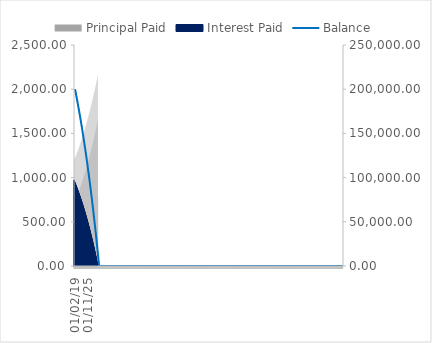
| Category | Principal Paid | Interest Paid |
|---|---|---|
| 01-02-19 | 1197.078 | 973.51 |
| 01-03-19 | 702.905 | 967.683 |
| 01-04-19 | 1206.326 | 964.262 |
| 01-05-19 | 712.198 | 958.39 |
| 01-06-19 | 1215.665 | 954.923 |
| 01-07-19 | 721.582 | 949.006 |
| 01-08-19 | 1225.095 | 945.494 |
| 01-09-19 | 731.058 | 939.53 |
| 01-10-19 | 1234.616 | 935.972 |
| 01-11-19 | 740.626 | 929.962 |
| 01-12-19 | 1244.231 | 926.357 |
| 01-01-20 | 750.287 | 920.301 |
| 01-02-20 | 1253.939 | 916.649 |
| 01-03-20 | 760.043 | 910.545 |
| 01-04-20 | 1263.742 | 906.846 |
| 01-05-20 | 769.894 | 900.695 |
| 01-06-20 | 1273.641 | 896.947 |
| 01-07-20 | 779.841 | 890.748 |
| 01-08-20 | 1283.637 | 886.952 |
| 01-09-20 | 789.885 | 880.703 |
| 01-10-20 | 1293.73 | 876.859 |
| 01-11-20 | 800.027 | 870.561 |
| 01-12-20 | 1303.921 | 866.667 |
| 01-01-21 | 810.268 | 860.32 |
| 01-02-21 | 1314.212 | 856.376 |
| 01-03-21 | 820.609 | 849.979 |
| 01-04-21 | 1324.603 | 845.985 |
| 01-05-21 | 831.051 | 839.537 |
| 01-06-21 | 1335.096 | 835.492 |
| 01-07-21 | 841.595 | 828.993 |
| 01-08-21 | 1345.691 | 824.897 |
| 01-09-21 | 852.241 | 818.347 |
| 01-10-21 | 1356.39 | 814.198 |
| 01-11-21 | 862.992 | 807.596 |
| 01-12-21 | 1367.193 | 803.395 |
| 01-01-22 | 873.848 | 796.741 |
| 01-02-22 | 1378.101 | 792.487 |
| 01-03-22 | 884.809 | 785.779 |
| 01-04-22 | 1389.116 | 781.472 |
| 01-05-22 | 895.878 | 774.711 |
| 01-06-22 | 1400.238 | 770.35 |
| 01-07-22 | 907.054 | 763.534 |
| 01-08-22 | 1411.469 | 759.119 |
| 01-09-22 | 918.34 | 752.249 |
| 01-10-22 | 1422.81 | 747.779 |
| 01-11-22 | 929.735 | 740.853 |
| 01-12-22 | 1434.261 | 736.328 |
| 01-01-23 | 941.242 | 729.346 |
| 01-02-23 | 1445.824 | 724.765 |
| 01-03-23 | 952.861 | 717.727 |
| 01-04-23 | 1457.499 | 713.089 |
| 01-05-23 | 964.594 | 705.994 |
| 01-06-23 | 1469.289 | 701.299 |
| 01-07-23 | 976.441 | 694.147 |
| 01-08-23 | 1481.194 | 689.395 |
| 01-09-23 | 988.403 | 682.185 |
| 01-10-23 | 1493.215 | 677.374 |
| 01-11-23 | 1000.483 | 670.105 |
| 01-12-23 | 1505.353 | 665.235 |
| 01-01-24 | 1012.68 | 657.908 |
| 01-02-24 | 1517.609 | 652.979 |
| 01-03-24 | 1024.996 | 645.592 |
| 01-04-24 | 1529.986 | 640.603 |
| 01-05-24 | 1037.433 | 633.155 |
| 01-06-24 | 1542.483 | 628.105 |
| 01-07-24 | 1049.991 | 620.597 |
| 01-08-24 | 1555.102 | 615.486 |
| 01-09-24 | 1062.671 | 607.917 |
| 01-10-24 | 1567.844 | 602.744 |
| 01-11-24 | 1075.475 | 595.113 |
| 01-12-24 | 1580.71 | 589.878 |
| 01-01-25 | 1088.405 | 582.184 |
| 01-02-25 | 1593.702 | 576.886 |
| 01-03-25 | 1101.46 | 569.128 |
| 01-04-25 | 1606.821 | 563.767 |
| 01-05-25 | 1114.643 | 555.946 |
| 01-06-25 | 1620.068 | 550.52 |
| 01-07-25 | 1127.954 | 542.634 |
| 01-08-25 | 1633.444 | 537.144 |
| 01-09-25 | 1141.395 | 529.193 |
| 01-10-25 | 1646.951 | 523.637 |
| 01-11-25 | 1154.968 | 515.621 |
| 01-12-25 | 1660.589 | 509.999 |
| 01-01-26 | 1168.672 | 501.916 |
| 01-02-26 | 1674.361 | 496.227 |
| 01-03-26 | 1182.511 | 488.077 |
| 01-04-26 | 1688.267 | 482.321 |
| 01-05-26 | 1196.485 | 474.104 |
| 01-06-26 | 1702.309 | 468.28 |
| 01-07-26 | 1210.595 | 459.994 |
| 01-08-26 | 1716.487 | 454.101 |
| 01-09-26 | 1224.842 | 445.746 |
| 01-10-26 | 1730.804 | 439.784 |
| 01-11-26 | 1239.229 | 431.359 |
| 01-12-26 | 1745.261 | 425.327 |
| 01-01-27 | 1253.756 | 416.832 |
| 01-02-27 | 1759.859 | 410.729 |
| 01-03-27 | 1268.425 | 402.163 |
| 01-04-27 | 1774.599 | 395.989 |
| 01-05-27 | 1283.237 | 387.351 |
| 01-06-27 | 1789.484 | 381.105 |
| 01-07-27 | 1298.194 | 372.394 |
| 01-08-27 | 1804.513 | 366.075 |
| 01-09-27 | 1313.297 | 357.292 |
| 01-10-27 | 1819.689 | 350.899 |
| 01-11-27 | 1328.546 | 342.042 |
| 01-12-27 | 1835.013 | 335.575 |
| 01-01-28 | 1343.945 | 326.643 |
| 01-02-28 | 1850.487 | 320.101 |
| 01-03-28 | 1359.494 | 311.094 |
| 01-04-28 | 1866.112 | 304.476 |
| 01-05-28 | 1375.195 | 295.393 |
| 01-06-28 | 1881.889 | 288.699 |
| 01-07-28 | 1391.049 | 279.539 |
| 01-08-28 | 1897.82 | 272.768 |
| 01-09-28 | 1407.058 | 263.53 |
| 01-10-28 | 1913.907 | 256.681 |
| 01-11-28 | 1423.223 | 247.365 |
| 01-12-28 | 1930.15 | 240.438 |
| 01-01-29 | 1439.546 | 231.043 |
| 01-02-29 | 1946.553 | 224.036 |
| 01-03-29 | 1456.028 | 214.561 |
| 01-04-29 | 1963.115 | 207.473 |
| 01-05-29 | 1472.67 | 197.918 |
| 01-06-29 | 1979.839 | 190.749 |
| 01-07-29 | 1489.476 | 181.113 |
| 01-08-29 | 1996.726 | 173.862 |
| 01-09-29 | 1506.445 | 164.143 |
| 01-10-29 | 2013.778 | 156.811 |
| 01-11-29 | 1523.58 | 147.008 |
| 01-12-29 | 2030.996 | 139.592 |
| 01-01-30 | 1540.882 | 129.706 |
| 01-02-30 | 2048.382 | 122.206 |
| 01-03-30 | 1558.353 | 112.235 |
| 01-04-30 | 2065.938 | 104.65 |
| 01-05-30 | 1575.994 | 94.594 |
| 01-06-30 | 2083.665 | 86.923 |
| 01-07-30 | 1593.808 | 76.78 |
| 01-08-30 | 2101.566 | 69.022 |
| 01-09-30 | 1611.795 | 58.793 |
| 01-10-30 | 2119.641 | 50.947 |
| 01-11-30 | 1629.958 | 40.63 |
| 01-12-30 | 2137.892 | 32.696 |
| 01-01-31 | 1648.298 | 22.29 |
| 01-02-31 | 2156.322 | 14.267 |
| 01-03-31 | 774.649 | 3.771 |